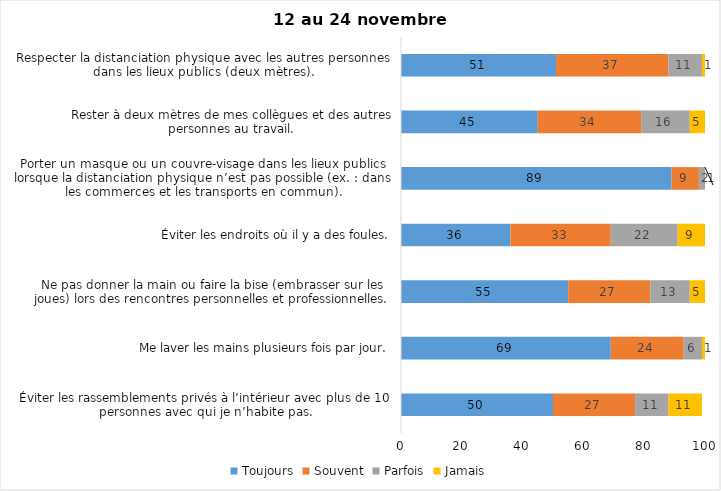
| Category | Toujours | Souvent | Parfois | Jamais |
|---|---|---|---|---|
| Éviter les rassemblements privés à l’intérieur avec plus de 10 personnes avec qui je n’habite pas. | 50 | 27 | 11 | 11 |
| Me laver les mains plusieurs fois par jour. | 69 | 24 | 6 | 1 |
| Ne pas donner la main ou faire la bise (embrasser sur les joues) lors des rencontres personnelles et professionnelles. | 55 | 27 | 13 | 5 |
| Éviter les endroits où il y a des foules. | 36 | 33 | 22 | 9 |
| Porter un masque ou un couvre-visage dans les lieux publics lorsque la distanciation physique n’est pas possible (ex. : dans les commerces et les transports en commun). | 89 | 9 | 2 | 1 |
| Rester à deux mètres de mes collègues et des autres personnes au travail. | 45 | 34 | 16 | 5 |
| Respecter la distanciation physique avec les autres personnes dans les lieux publics (deux mètres). | 51 | 37 | 11 | 1 |